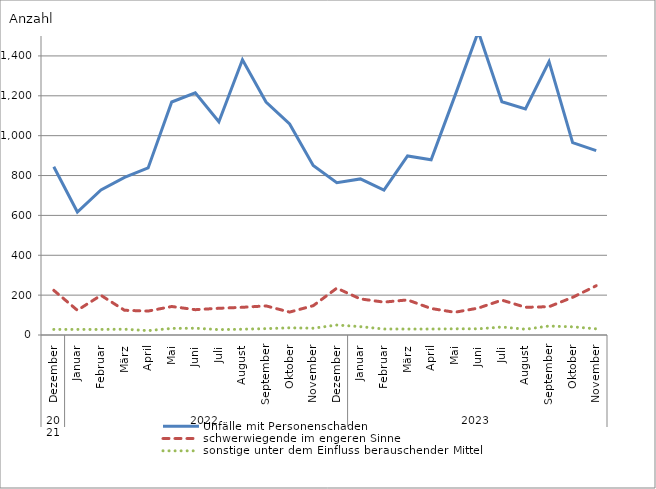
| Category | Unfälle mit Personenschaden | schwerwiegende im engeren Sinne | sonstige unter dem Einfluss berauschender Mittel |
|---|---|---|---|
| 0 | 844 | 224 | 28 |
| 1 | 617 | 124 | 28 |
| 2 | 728 | 199 | 28 |
| 3 | 791 | 124 | 29 |
| 4 | 838 | 120 | 22 |
| 5 | 1169 | 143 | 33 |
| 6 | 1215 | 127 | 34 |
| 7 | 1070 | 134 | 27 |
| 8 | 1381 | 139 | 29 |
| 9 | 1169 | 146 | 32 |
| 10 | 1059 | 115 | 36 |
| 11 | 850 | 147 | 34 |
| 12 | 764 | 235 | 50 |
| 13 | 783 | 181 | 42 |
| 14 | 727 | 165 | 30 |
| 15 | 898 | 176 | 30 |
| 16 | 879 | 133 | 30 |
| 17 | 1197 | 114 | 31 |
| 18 | 1522 | 135 | 31 |
| 19 | 1170 | 175 | 40 |
| 20 | 1134 | 139 | 29 |
| 21 | 1372 | 142 | 45 |
| 22 | 965 | 189 | 41 |
| 23 | 925 | 247 | 31 |